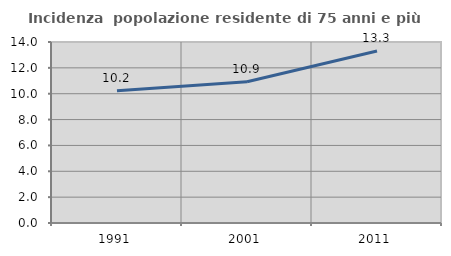
| Category | Incidenza  popolazione residente di 75 anni e più |
|---|---|
| 1991.0 | 10.231 |
| 2001.0 | 10.929 |
| 2011.0 | 13.308 |